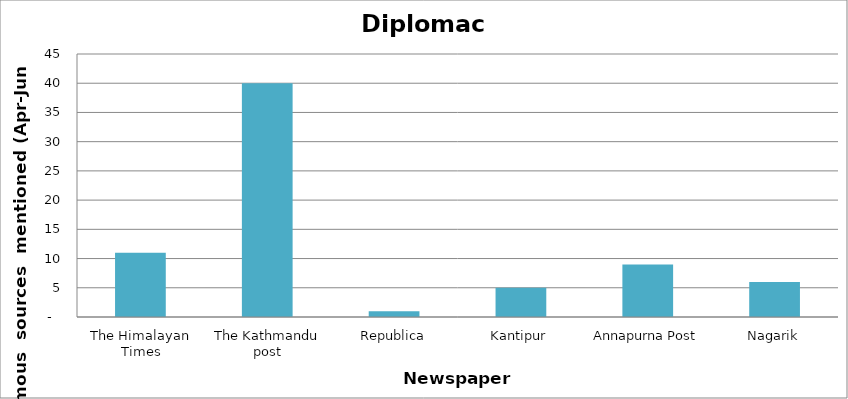
| Category | Diplomacy |
|---|---|
| The Himalayan Times | 11 |
| The Kathmandu post | 40 |
| Republica | 1 |
| Kantipur | 5 |
| Annapurna Post | 9 |
| Nagarik | 6 |